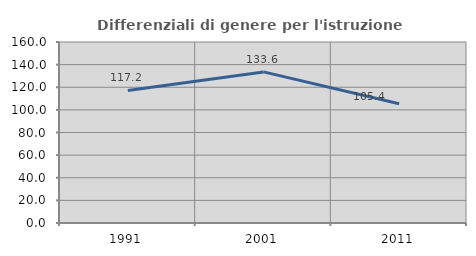
| Category | Differenziali di genere per l'istruzione superiore |
|---|---|
| 1991.0 | 117.198 |
| 2001.0 | 133.577 |
| 2011.0 | 105.372 |